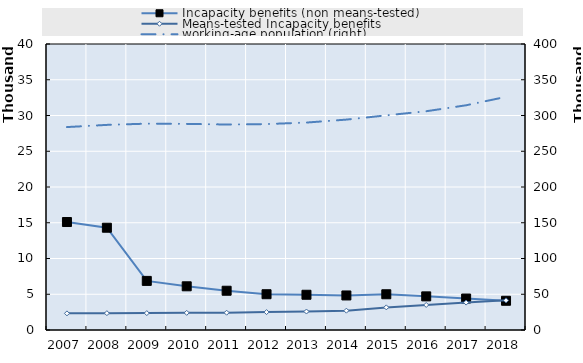
| Category | Incapacity benefits (non means-tested) | Means-tested Incapacity benefits |
|---|---|---|
| 2007.0 | 15102.5 | 2325.75 |
| 2008.0 | 14303.75 | 2354.25 |
| 2009.0 | 6866.5 | 2361 |
| 2010.0 | 6112 | 2395.75 |
| 2011.0 | 5490 | 2419 |
| 2012.0 | 5003 | 2503 |
| 2013.0 | 4930 | 2584 |
| 2014.0 | 4830 | 2704 |
| 2015.0 | 4999 | 3163 |
| 2016.0 | 4703 | 3502 |
| 2017.0 | 4401 | 3835 |
| 2018.0 | 4088 | 4149 |